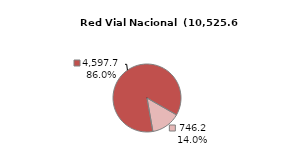
| Category | RV Nacional |
|---|---|
| Pavimentada | 4597.713 |
| No Pavimentada | 746.16 |